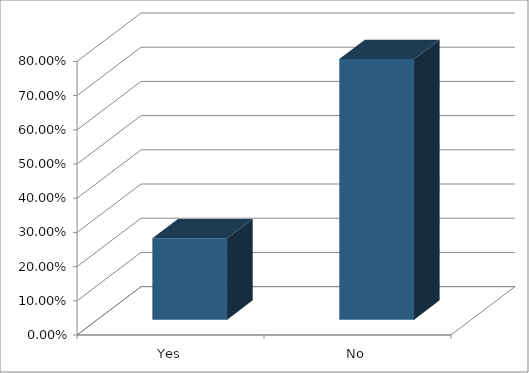
| Category | Series 0 |
|---|---|
| Yes | 0.238 |
| No | 0.762 |